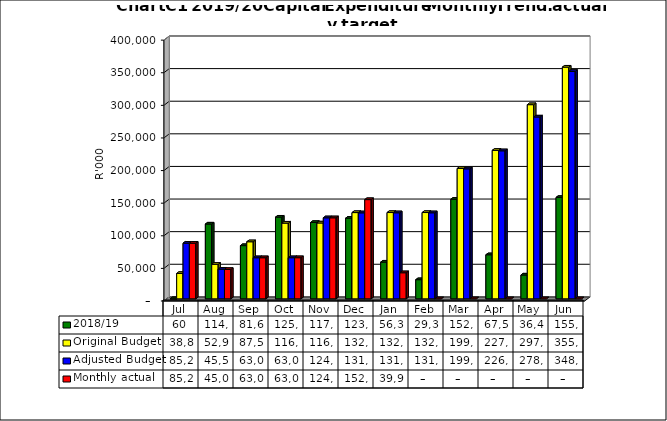
| Category | 2018/19 | Original Budget | Adjusted Budget | Monthly actual |
|---|---|---|---|---|
| Jul | 59892 | 38885000 | 85297669.12 | 85297669.12 |
| Aug | 114658356.076 | 52927000 | 45515291.767 | 45020699.329 |
| Sep | 81613647.633 | 87521000 | 63024484.609 | 63024484.609 |
| Oct | 125253452.407 | 116093000 | 63068303.312 | 63068303.312 |
| Nov | 117057421.925 | 116300000 | 124247725.67 | 124247725.667 |
| Dec | 123680771.708 | 132266000 | 131868000 | 152138184.79 |
| Jan | 56304819.372 | 132336000 | 131938000 | 39985326.879 |
| Feb | 29352943.088 | 132336000 | 131938000 | 0 |
| Mar | 152645868.565 | 199883000 | 199282000 | 0 |
| Apr | 67570203.105 | 227676000 | 226991000 | 0 |
| May | 36486409.167 | 297703000 | 278808000 | 0 |
| Jun | 155412588.422 | 355259999.6 | 348653637.522 | 0 |